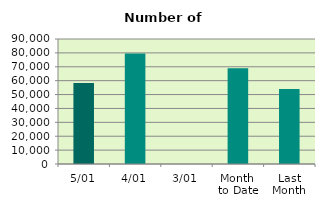
| Category | Series 0 |
|---|---|
| 5/01 | 58372 |
| 4/01 | 79498 |
| 3/01 | 0 |
| Month 
to Date | 68935 |
| Last
Month | 53997.143 |